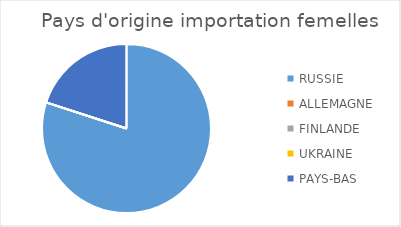
| Category | Series 0 |
|---|---|
| RUSSIE | 4 |
| ALLEMAGNE | 0 |
| FINLANDE | 0 |
| UKRAINE | 0 |
| PAYS-BAS | 1 |